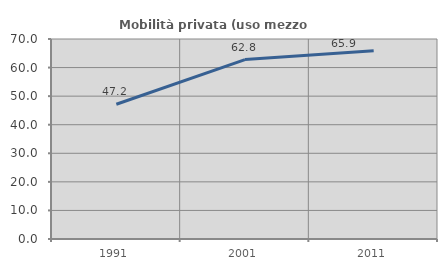
| Category | Mobilità privata (uso mezzo privato) |
|---|---|
| 1991.0 | 47.176 |
| 2001.0 | 62.807 |
| 2011.0 | 65.911 |